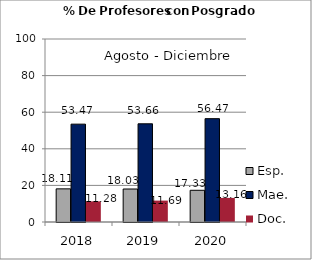
| Category | Esp. | Mae. | Doc. |
|---|---|---|---|
| 2018.0 | 18.11 | 53.47 | 11.28 |
| 2019.0 | 18.03 | 53.66 | 11.69 |
| 2020.0 | 17.33 | 56.47 | 13.16 |